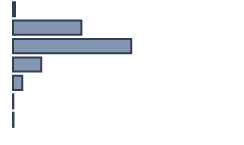
| Category | Series 0 |
|---|---|
| 0 | 0.936 |
| 1 | 30.124 |
| 2 | 52.079 |
| 3 | 12.472 |
| 4 | 4.041 |
| 5 | 0.137 |
| 6 | 0.21 |